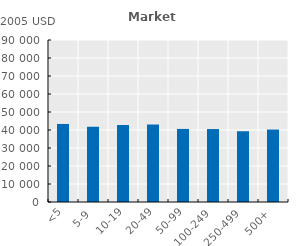
| Category | Series 0 |
|---|---|
| <5 | 43353.77 |
| 5-9 | 41801.48 |
| 10-19 | 42785.82 |
| 20-49 | 43043.703 |
| 50-99 | 40593.395 |
| 100-249 | 40526.656 |
| 250-499 | 39313.656 |
| 500+ | 40255.527 |